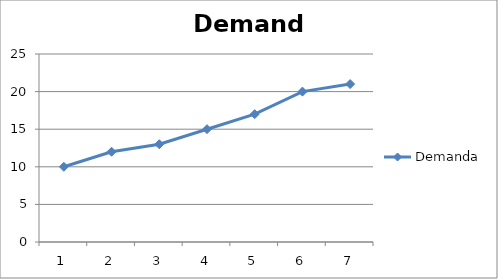
| Category | Demanda |
|---|---|
| 0 | 10 |
| 1 | 12 |
| 2 | 13 |
| 3 | 15 |
| 4 | 17 |
| 5 | 20 |
| 6 | 21 |